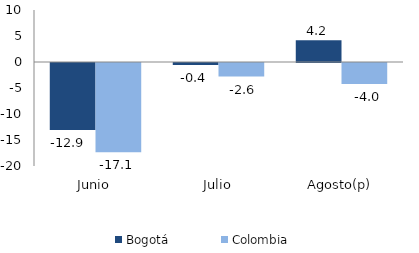
| Category | Bogotá | Colombia |
|---|---|---|
| Junio | -12.885 | -17.141 |
| Julio | -0.393 | -2.616 |
| Agosto(p) | 4.172 | -4.031 |